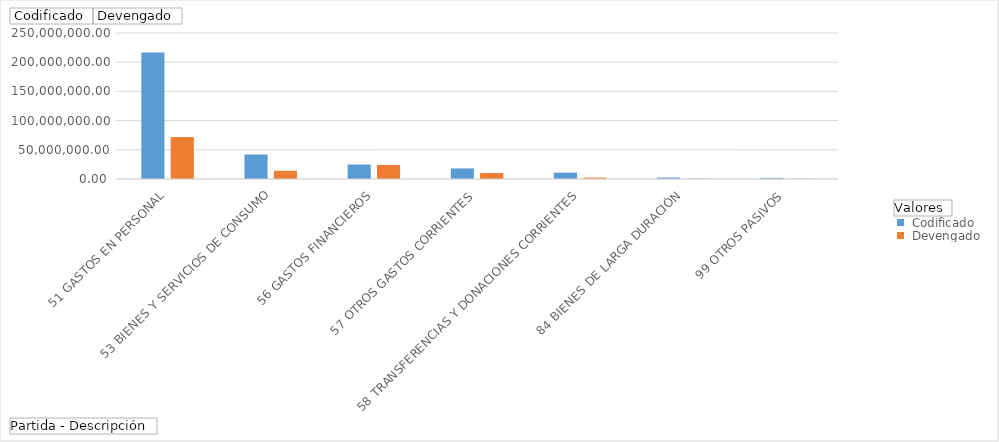
| Category |  Codificado |  Devengado |
|---|---|---|
| 51 GASTOS EN PERSONAL | 216666702.3 | 71823669.03 |
| 53 BIENES Y SERVICIOS DE CONSUMO | 41930736.91 | 14027960.88 |
| 56 GASTOS FINANCIEROS | 24790066.98 | 24012742.25 |
| 57 OTROS GASTOS CORRIENTES | 18045493.07 | 10188514.14 |
| 58 TRANSFERENCIAS Y DONACIONES CORRIENTES | 10845210.02 | 2410762.61 |
| 84 BIENES DE LARGA DURACIÓN | 2516954.5 | 523063.95 |
| 99 OTROS PASIVOS | 1876624.19 | 501294.81 |